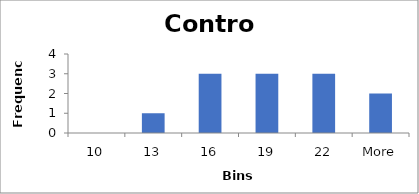
| Category | Frequency |
|---|---|
| 10 | 0 |
| 13 | 1 |
| 16 | 3 |
| 19 | 3 |
| 22 | 3 |
| More | 2 |